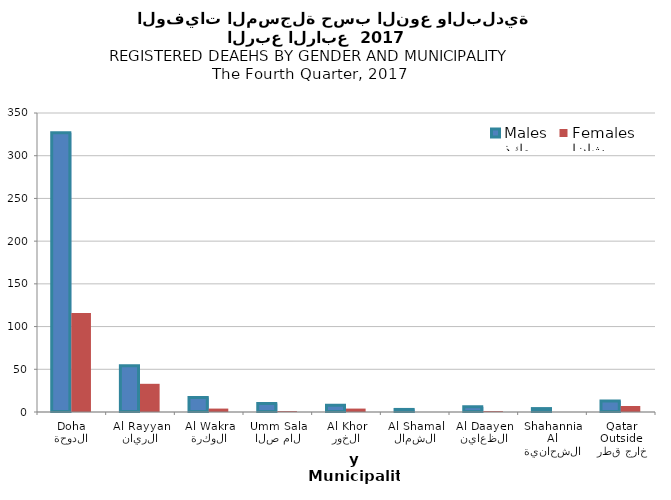
| Category | ذكور
Males | إناث
Females |
|---|---|---|
| الدوحة
Doha | 327 | 116 |
| الريان
Al Rayyan | 54 | 33 |
| الوكرة
Al Wakra | 17 | 4 |
| ام صلال
Umm Salal | 10 | 1 |
| الخور
Al Khor | 8 | 4 |
| الشمال
Al Shamal | 3 | 0 |
| الظعاين
Al Daayen | 6 | 1 |
| الشحانية
Al Shahannia | 4 | 0 |
| خارج قطر
Outside Qatar | 13 | 7 |